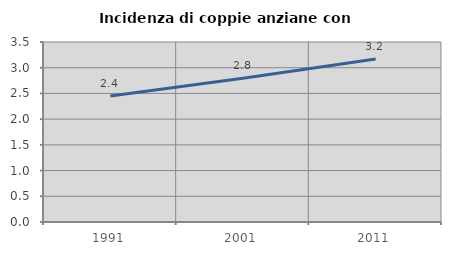
| Category | Incidenza di coppie anziane con figli |
|---|---|
| 1991.0 | 2.45 |
| 2001.0 | 2.794 |
| 2011.0 | 3.171 |